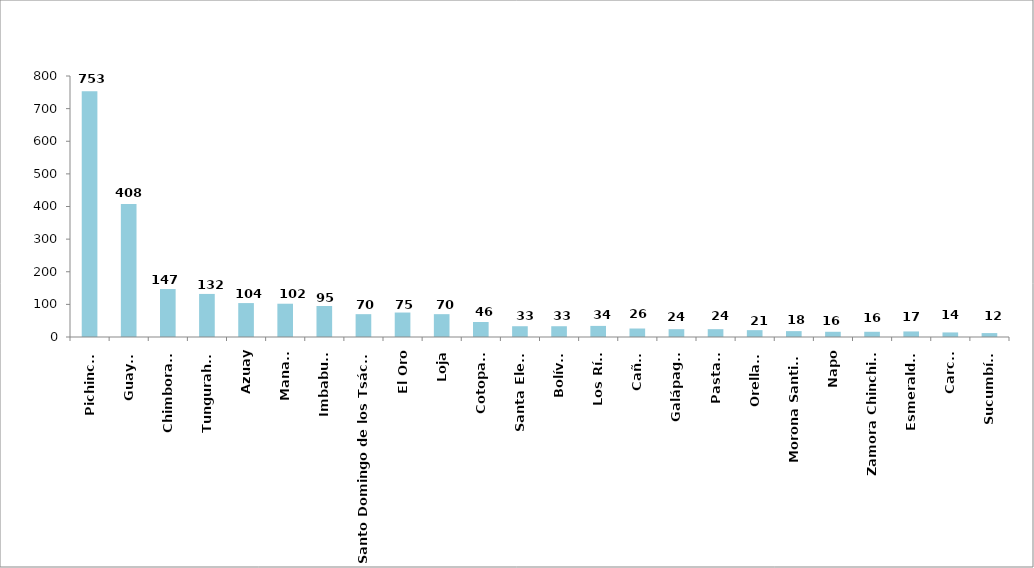
| Category | Series 0 |
|---|---|
| Pichincha | 753 |
| Guayas | 408 |
| Chimborazo | 147 |
| Tungurahua | 132 |
| Azuay | 104 |
| Manabí | 102 |
| Imbabura | 95 |
| Santo Domingo de los Tsáchilas | 70 |
| El Oro | 75 |
| Loja | 70 |
| Cotopaxi | 46 |
| Santa Elena | 33 |
| Bolívar | 33 |
| Los Ríos | 34 |
| Cañar | 26 |
| Galápagos | 24 |
| Pastaza | 24 |
| Orellana | 21 |
| Morona Santiago | 18 |
| Napo | 16 |
| Zamora Chinchipe | 16 |
| Esmeraldas | 17 |
| Carchi | 14 |
| Sucumbíos | 12 |